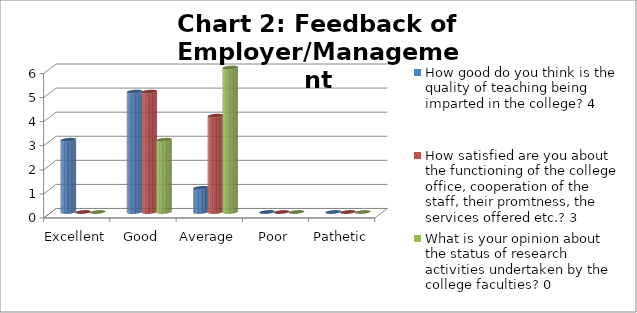
| Category | How good do you think is the quality of teaching being imparted in the college? 4 | How satisfied are you about the functioning of the college office, cooperation of the staff, their promtness, the services offered etc.? 3 | What is your opinion about the status of research activities undertaken by the college faculties? 0 |
|---|---|---|---|
| Excellent | 3 | 0 | 0 |
| Good | 5 | 5 | 3 |
| Average | 1 | 4 | 6 |
| Poor | 0 | 0 | 0 |
| Pathetic | 0 | 0 | 0 |